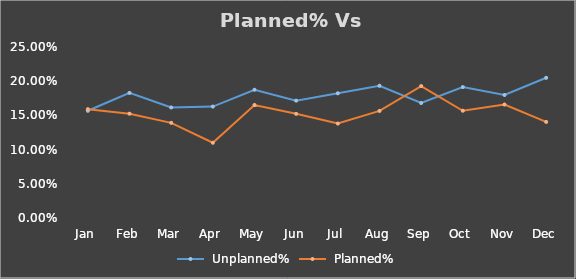
| Category |  Unplanned% |  Planned% |
|---|---|---|
| Jan | 0.157 | 0.159 |
| Feb | 0.183 | 0.152 |
| Mar | 0.162 | 0.139 |
| Apr | 0.163 | 0.11 |
| May | 0.188 | 0.165 |
| Jun | 0.172 | 0.152 |
| Jul | 0.182 | 0.138 |
| Aug | 0.193 | 0.157 |
| Sep | 0.168 | 0.193 |
| Oct | 0.191 | 0.157 |
| Nov | 0.18 | 0.166 |
| Dec | 0.205 | 0.14 |